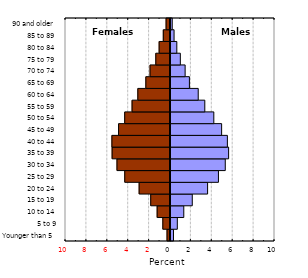
| Category | Series 0 |
|---|---|
| Younger than 5 | 0.287 |
| 5 to 9 | 0.653 |
| 10 to 14 | 1.272 |
| 15 to 19 | 2.083 |
| 20 to 24 | 3.55 |
| 25 to 29 | 4.588 |
| 30 to 34 | 5.241 |
| 35 to 39 | 5.562 |
| 40 to 44 | 5.443 |
| 45 to 49 | 4.894 |
| 50 to 54 | 4.146 |
| 55 to 59 | 3.282 |
| 60 to 64 | 2.653 |
| 65 to 69 | 1.81 |
| 70 to 74 | 1.4 |
| 75 to 79 | 0.941 |
| 80 to 84 | 0.606 |
| 85 to 89 | 0.341 |
| 90 and older | 0.165 |